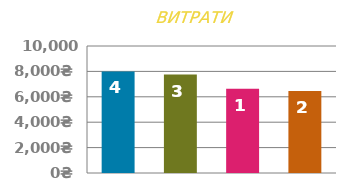
| Category | ПОЧАТКОВИЙ |
|---|---|
| 0 | 8000 |
| 1 | 7750 |
| 2 | 6625 |
| 3 | 6450 |